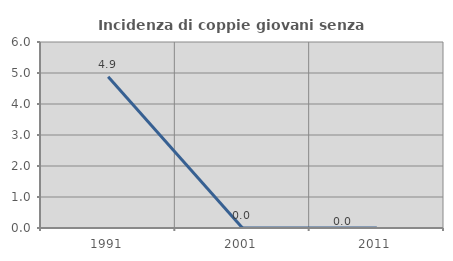
| Category | Incidenza di coppie giovani senza figli |
|---|---|
| 1991.0 | 4.878 |
| 2001.0 | 0 |
| 2011.0 | 0 |